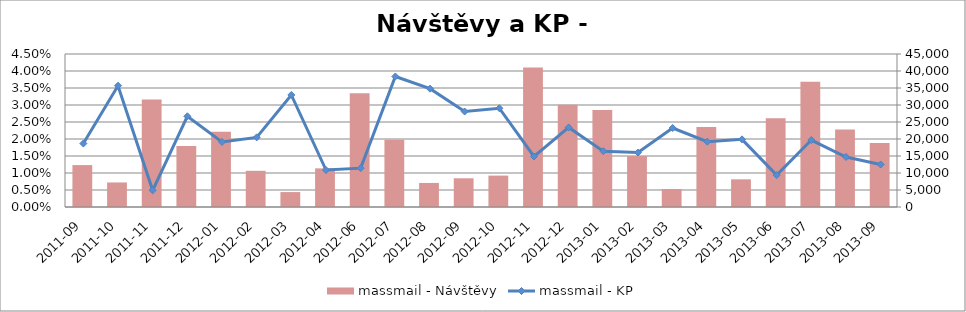
| Category | massmail - Návštěvy |
|---|---|
| 2011-09 | 12327.664 |
| 2011-10 | 7216.225 |
| 2011-11 | 31600.733 |
| 2011-12 | 17940.773 |
| 2012-01 | 22139.884 |
| 2012-02 | 10645.169 |
| 2012-03 | 4385.495 |
| 2012-04 | 11361.202 |
| 2012-06 | 33484.188 |
| 2012-07 | 19762.313 |
| 2012-08 | 7074.53 |
| 2012-09 | 8445.879 |
| 2012-10 | 9235.156 |
| 2012-11 | 41000.57 |
| 2012-12 | 30069.364 |
| 2013-01 | 28521.089 |
| 2013-02 | 15032.705 |
| 2013-03 | 5301.52 |
| 2013-04 | 23525.113 |
| 2013-05 | 8136.313 |
| 2013-06 | 26073.192 |
| 2013-07 | 36834.952 |
| 2013-08 | 22787.702 |
| 2013-09 | 18793.846 |